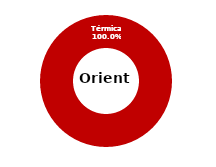
| Category | Oriente |
|---|---|
| Eólica | 0 |
| Hidráulica | 0 |
| Solar | 0 |
| Térmica | 30.943 |